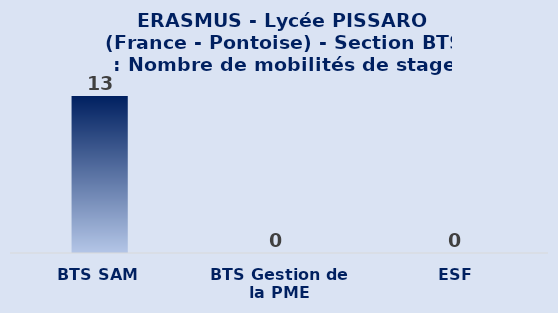
| Category | ERASMUS - Lycée PISSARO (France - Pontoise) - Section BTS : Nombre de mobilités de stage |
|---|---|
| BTS SAM | 13 |
| BTS Gestion de la PME | 0 |
| ESF | 0 |